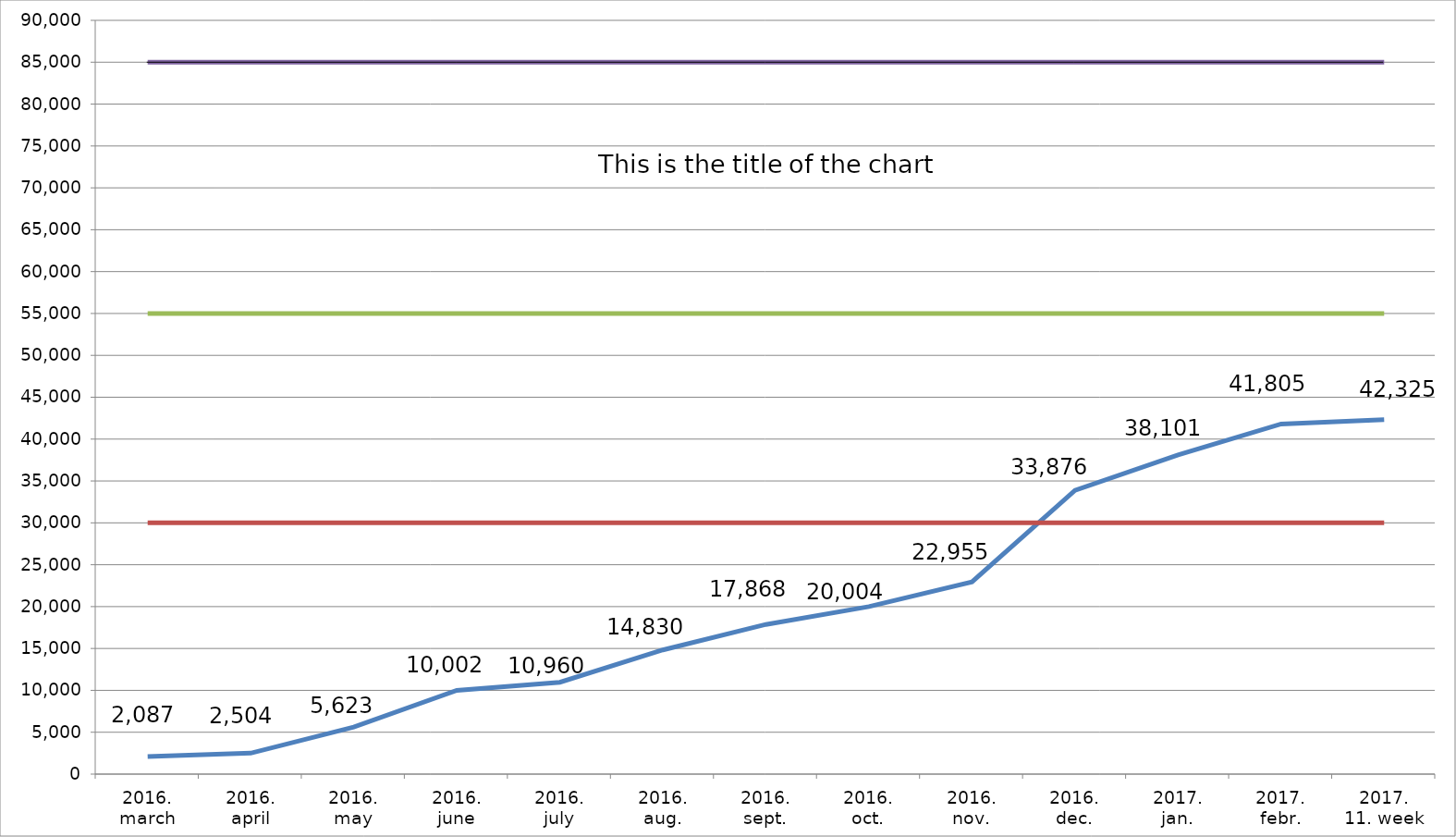
| Category | Chart data (numbers) | target v. | target v. 2 | target v. 3 |
|---|---|---|---|---|
| 2016.
march | 2087 | 30000 | 55000 | 85000 |
| 2016.
april | 2504 | 30000 | 55000 | 85000 |
| 2016.
may | 5623 | 30000 | 55000 | 85000 |
| 2016.
june | 10002 | 30000 | 55000 | 85000 |
| 2016.
july | 10960 | 30000 | 55000 | 85000 |
| 2016.
aug. | 14830 | 30000 | 55000 | 85000 |
| 2016.
sept. | 17868 | 30000 | 55000 | 85000 |
| 2016.
oct. | 20004 | 30000 | 55000 | 85000 |
| 2016.
nov. | 22955 | 30000 | 55000 | 85000 |
| 2016.
dec. | 33876 | 30000 | 55000 | 85000 |
| 2017.
jan. | 38101 | 30000 | 55000 | 85000 |
| 2017.
febr. | 41805 | 30000 | 55000 | 85000 |
| 2017.
11. week | 42325 | 30000 | 55000 | 85000 |